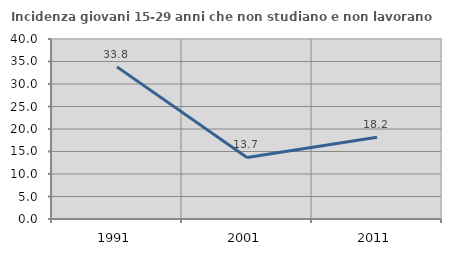
| Category | Incidenza giovani 15-29 anni che non studiano e non lavorano  |
|---|---|
| 1991.0 | 33.803 |
| 2001.0 | 13.684 |
| 2011.0 | 18.182 |